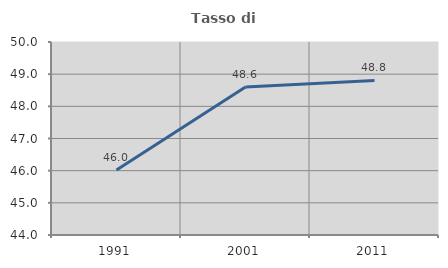
| Category | Tasso di occupazione   |
|---|---|
| 1991.0 | 46.022 |
| 2001.0 | 48.604 |
| 2011.0 | 48.804 |